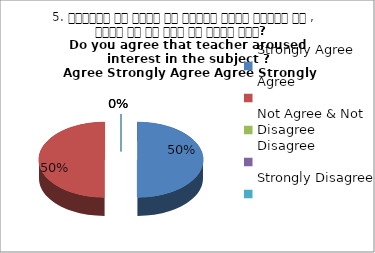
| Category | 5. शिक्षक ने विषय के प्रति रूचि जागृत की , क्या आप इस बात से सहमत हैं?  
Do you agree that teacher aroused interest in the subject ?
 Agree Strongly Agree Agree Strongly Agree |
|---|---|
| Strongly Agree | 2 |
| Agree | 2 |
| Not Agree & Not Disagree | 0 |
| Disagree | 0 |
| Strongly Disagree | 0 |